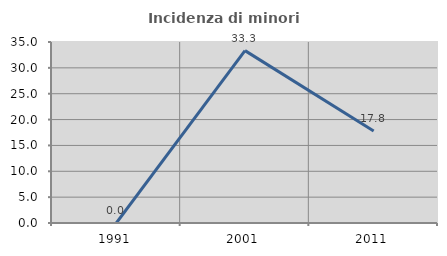
| Category | Incidenza di minori stranieri |
|---|---|
| 1991.0 | 0 |
| 2001.0 | 33.333 |
| 2011.0 | 17.808 |